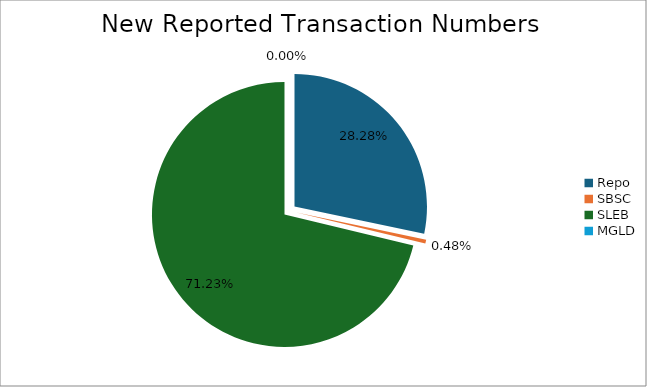
| Category | Series 0 |
|---|---|
| Repo | 345644 |
| SBSC | 5915 |
| SLEB | 870522 |
| MGLD | 21 |